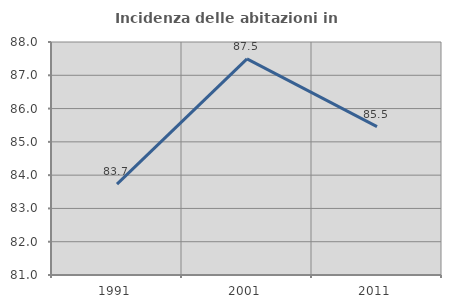
| Category | Incidenza delle abitazioni in proprietà  |
|---|---|
| 1991.0 | 83.732 |
| 2001.0 | 87.491 |
| 2011.0 | 85.456 |